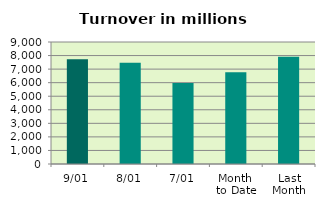
| Category | Series 0 |
|---|---|
| 9/01 | 7729.143 |
| 8/01 | 7460.541 |
| 7/01 | 5970.49 |
| Month 
to Date | 6768.194 |
| Last
Month | 7903.143 |